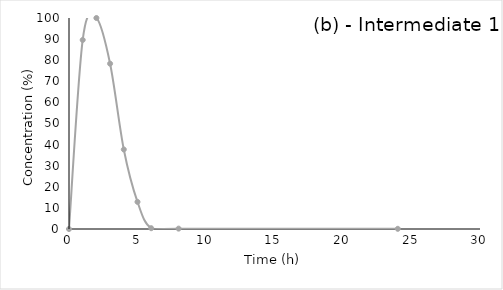
| Category | Series 2 |
|---|---|
| 0.0 | 0 |
| 1.0 | 89.597 |
| 2.0 | 100 |
| 3.0 | 78.346 |
| 4.0 | 37.695 |
| 5.0 | 12.852 |
| 6.0 | 0.38 |
| 8.0 | 0.177 |
| 24.0 | 0.089 |